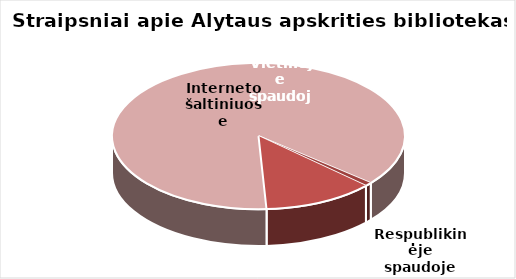
| Category | Series 0 |
|---|---|
| Respublikinėje spaudoje | 18 |
| Vietinėje spaudoje | 279 |
| Interneto šaltiniuose | 1984 |